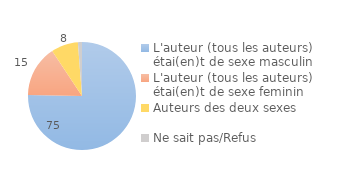
| Category | Series 0 |
|---|---|
| L'auteur (tous les auteurs) étai(en)t de sexe masculin | 75.442 |
| L'auteur (tous les auteurs) étai(en)t de sexe feminin | 15.384 |
| Auteurs des deux sexes | 8.1 |
| Ne sait pas/Refus | 1.223 |